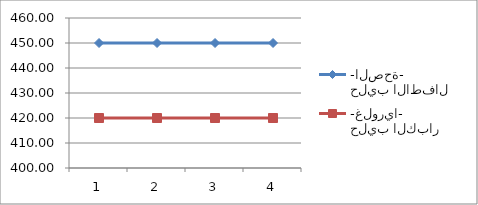
| Category | حليب الاطفال -الصحة- | حليب الكبار -غلوريا- |
|---|---|---|
| 0 | 450 | 420 |
| 1 | 450 | 420 |
| 2 | 450 | 420 |
| 3 | 450 | 420 |